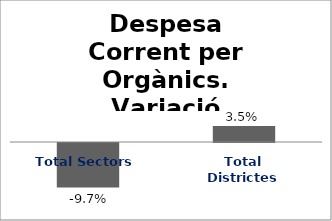
| Category | Series 0 |
|---|---|
| Total Sectors | -0.097 |
| Total Districtes | 0.035 |